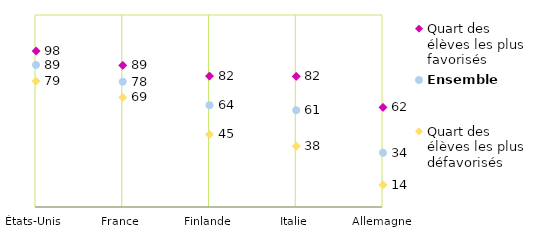
| Category | Quart des élèves les plus favorisés | Ensemble | Quart des élèves les plus défavorisés |
|---|---|---|---|
| États-Unis | 97.5 | 88.8 | 78.7 |
| France | 88.5 | 78.3 | 68.5 |
| Finlande | 81.8 | 63.6 | 45.4 |
| Italie | 81.6 | 60.5 | 38.1 |
| Allemagne | 62.3 | 33.9 | 13.9 |